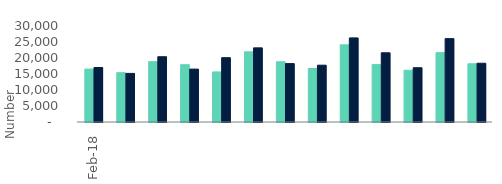
| Category | Full market | Remortgage No Equity Withdrawn |
|---|---|---|
| 2018-02-01 | 16540 | 17030 |
| 2018-03-01 | 15410 | 15190 |
| 2018-04-01 | 18860 | 20400 |
| 2018-05-01 | 17900 | 16530 |
| 2018-06-01 | 15640 | 20100 |
| 2018-07-01 | 21930 | 23170 |
| 2018-08-01 | 18820 | 18250 |
| 2018-09-01 | 16710 | 17750 |
| 2018-10-01 | 24120 | 26280 |
| 2018-11-01 | 17930 | 21630 |
| 2018-12-01 | 16160 | 16960 |
| 2019-01-01 | 21670 | 26050 |
| 2019-02-01 | 18200 | 18360 |